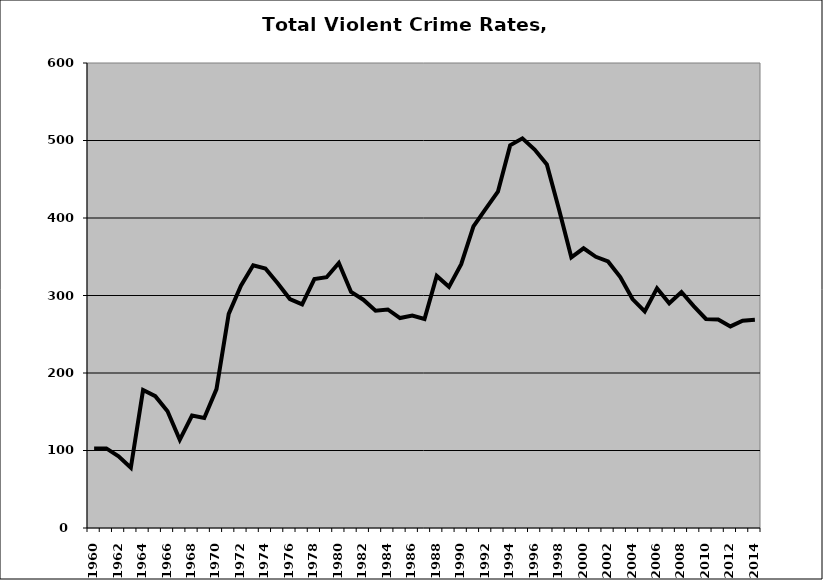
| Category | VCR |
|---|---|
| 1960.0 | 102.656 |
| 1961.0 | 102.664 |
| 1962.0 | 92.482 |
| 1963.0 | 77.686 |
| 1964.0 | 177.96 |
| 1965.0 | 170.142 |
| 1966.0 | 150.58 |
| 1967.0 | 113.799 |
| 1968.0 | 145.047 |
| 1969.0 | 141.938 |
| 1970.0 | 179.258 |
| 1971.0 | 276.325 |
| 1972.0 | 312.682 |
| 1973.0 | 339.062 |
| 1974.0 | 334.854 |
| 1975.0 | 315.899 |
| 1976.0 | 295.412 |
| 1977.0 | 288.656 |
| 1978.0 | 321.173 |
| 1979.0 | 323.608 |
| 1980.0 | 341.948 |
| 1981.0 | 304.585 |
| 1982.0 | 294.59 |
| 1983.0 | 280.441 |
| 1984.0 | 281.986 |
| 1985.0 | 270.915 |
| 1986.0 | 274.133 |
| 1987.0 | 269.752 |
| 1988.0 | 325.238 |
| 1989.0 | 311.179 |
| 1990.0 | 340.352 |
| 1991.0 | 389.082 |
| 1992.0 | 411.744 |
| 1993.0 | 433.863 |
| 1994.0 | 493.706 |
| 1995.0 | 502.781 |
| 1996.0 | 488.255 |
| 1997.0 | 468.986 |
| 1998.0 | 410.683 |
| 1999.0 | 349.308 |
| 2000.0 | 360.922 |
| 2001.0 | 349.893 |
| 2002.0 | 343.876 |
| 2003.0 | 323.875 |
| 2004.0 | 295.37 |
| 2005.0 | 279.56 |
| 2006.0 | 309.324 |
| 2007.0 | 289.881 |
| 2008.0 | 304.468 |
| 2009.0 | 286.281 |
| 2010.0 | 269.707 |
| 2011.0 | 268.988 |
| 2012.0 | 260.142 |
| 2013.0 | 267.528 |
| 2014.0 | 268.664 |